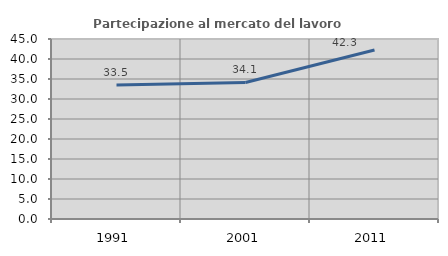
| Category | Partecipazione al mercato del lavoro  femminile |
|---|---|
| 1991.0 | 33.525 |
| 2001.0 | 34.132 |
| 2011.0 | 42.256 |